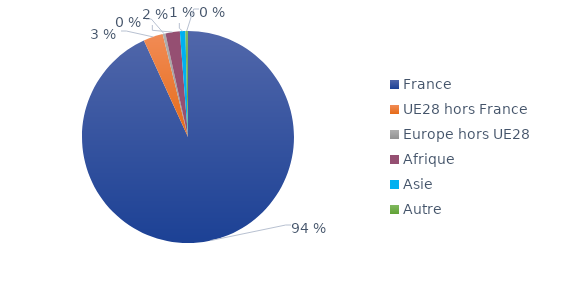
| Category | Series 0 |
|---|---|
| France | 0.937 |
| UE28 hors France | 0.03 |
| Europe hors UE28 | 0.004 |
| Afrique | 0.022 |
| Asie | 0.008 |
| Autre | 0.004 |